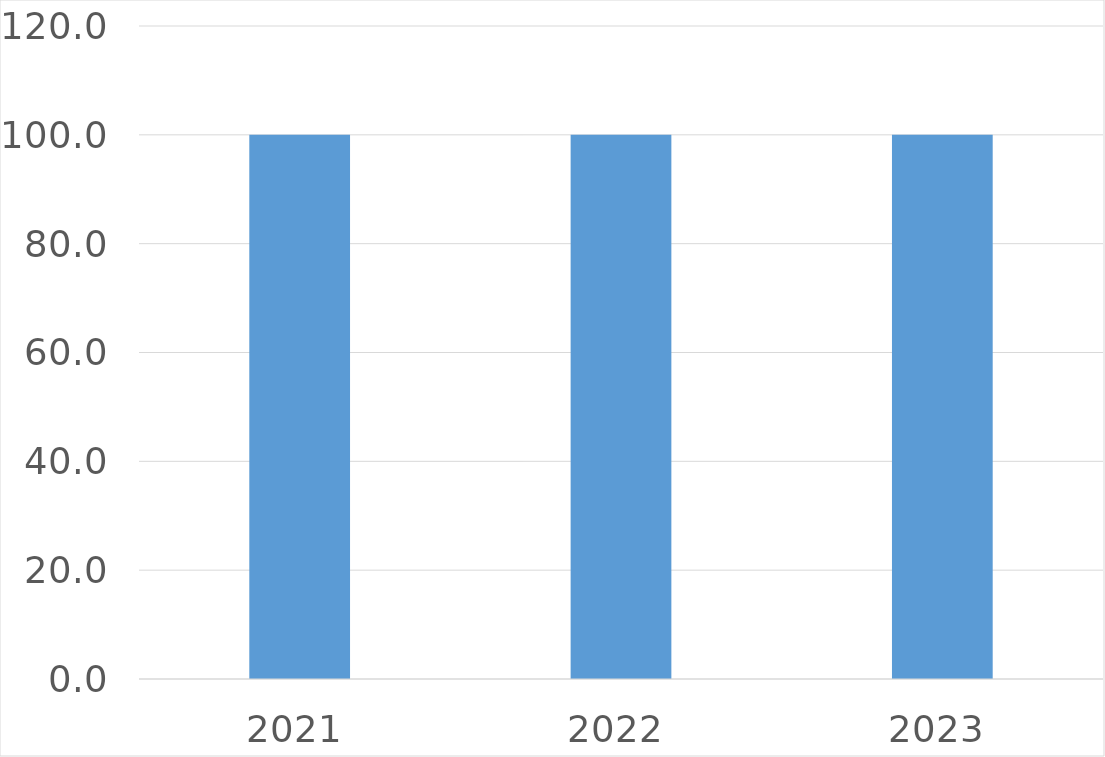
| Category | Series 0 |
|---|---|
| 2021 | 100 |
| 2022 | 100 |
| 2023 | 100 |